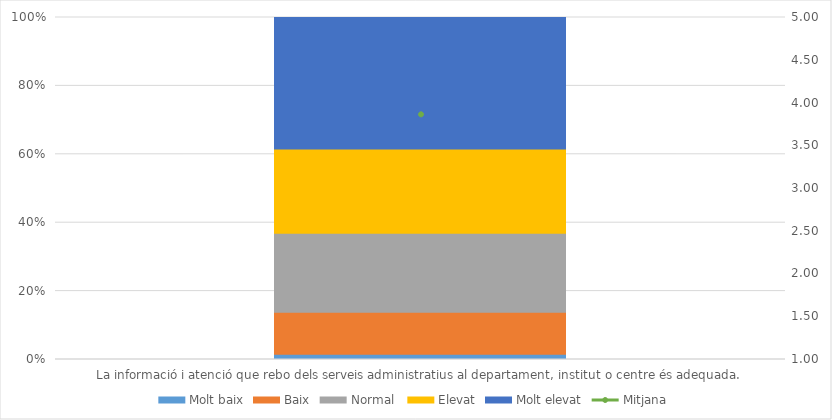
| Category | Molt baix | Baix | Normal  | Elevat | Molt elevat |
|---|---|---|---|---|---|
| La informació i atenció que rebo dels serveis administratius al departament, institut o centre és adequada. | 1 | 8 | 15 | 16 | 25 |